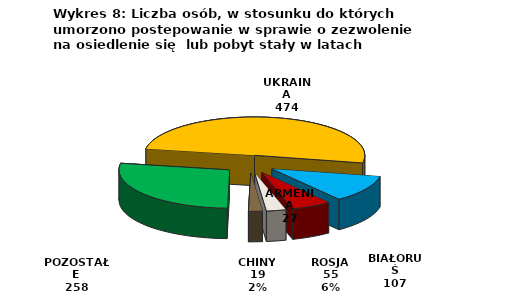
| Category | Series 0 |
|---|---|
| UKRAINA | 474 |
| BIAŁORUŚ | 107 |
| ROSJA | 55 |
| ARMENIA | 27 |
| CHINY | 19 |
| POZOSTAŁE | 258 |